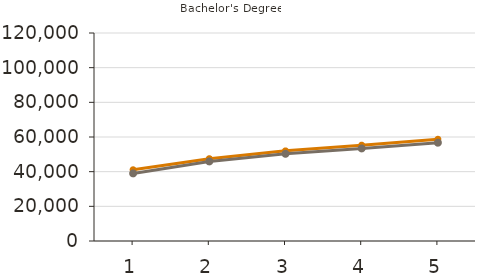
| Category | Mean | Median |
|---|---|---|
| 1.0 | 41100 | 39000 |
| 2.0 | 47500 | 45900 |
| 3.0 | 52000 | 50300 |
| 4.0 | 55300 | 53400 |
| 5.0 | 58700 | 56700 |